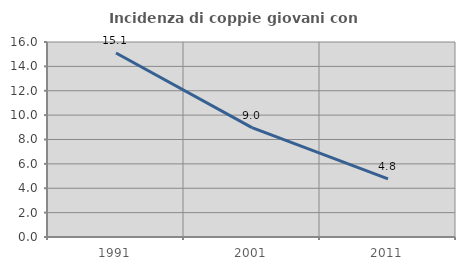
| Category | Incidenza di coppie giovani con figli |
|---|---|
| 1991.0 | 15.094 |
| 2001.0 | 8.974 |
| 2011.0 | 4.762 |